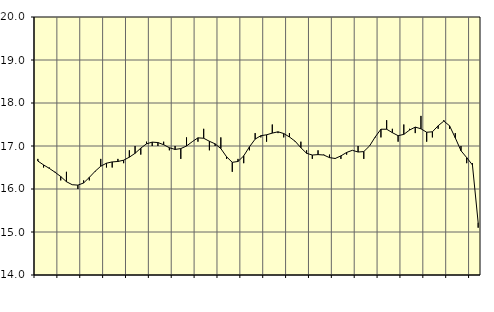
| Category | Piggar | Handel, SNI 45-47 |
|---|---|---|
| nan | 16.7 | 16.65 |
| 1.0 | 16.5 | 16.56 |
| 1.0 | 16.5 | 16.48 |
| 1.0 | 16.4 | 16.39 |
| nan | 16.2 | 16.29 |
| 2.0 | 16.4 | 16.17 |
| 2.0 | 16.1 | 16.1 |
| 2.0 | 16 | 16.09 |
| nan | 16.2 | 16.14 |
| 3.0 | 16.2 | 16.27 |
| 3.0 | 16.4 | 16.41 |
| 3.0 | 16.7 | 16.53 |
| nan | 16.5 | 16.6 |
| 4.0 | 16.5 | 16.63 |
| 4.0 | 16.7 | 16.64 |
| 4.0 | 16.6 | 16.67 |
| nan | 16.9 | 16.74 |
| 5.0 | 17 | 16.83 |
| 5.0 | 16.8 | 16.95 |
| 5.0 | 17.1 | 17.05 |
| nan | 17 | 17.09 |
| 6.0 | 17 | 17.08 |
| 6.0 | 17.1 | 17.03 |
| 6.0 | 16.9 | 16.96 |
| nan | 17 | 16.92 |
| 7.0 | 16.7 | 16.94 |
| 7.0 | 17.2 | 17 |
| 7.0 | 17.1 | 17.1 |
| nan | 17.1 | 17.19 |
| 8.0 | 17.4 | 17.18 |
| 8.0 | 16.9 | 17.11 |
| 8.0 | 17 | 17.05 |
| nan | 17.2 | 16.94 |
| 9.0 | 16.7 | 16.75 |
| 9.0 | 16.4 | 16.62 |
| 9.0 | 16.7 | 16.64 |
| nan | 16.6 | 16.77 |
| 10.0 | 16.9 | 16.98 |
| 10.0 | 17.3 | 17.16 |
| 10.0 | 17.2 | 17.24 |
| nan | 17.1 | 17.26 |
| 11.0 | 17.5 | 17.3 |
| 11.0 | 17.3 | 17.33 |
| 11.0 | 17.2 | 17.29 |
| nan | 17.3 | 17.21 |
| 12.0 | 17.1 | 17.11 |
| 12.0 | 17.1 | 16.96 |
| 12.0 | 16.9 | 16.83 |
| nan | 16.7 | 16.79 |
| 13.0 | 16.9 | 16.8 |
| 13.0 | 16.8 | 16.79 |
| 13.0 | 16.8 | 16.73 |
| nan | 16.7 | 16.71 |
| 14.0 | 16.7 | 16.77 |
| 14.0 | 16.8 | 16.85 |
| 14.0 | 16.9 | 16.9 |
| nan | 17 | 16.86 |
| 15.0 | 16.7 | 16.87 |
| 15.0 | 17 | 17 |
| 15.0 | 17.2 | 17.21 |
| nan | 17.2 | 17.39 |
| 16.0 | 17.6 | 17.39 |
| 16.0 | 17.4 | 17.31 |
| 16.0 | 17.1 | 17.24 |
| nan | 17.5 | 17.27 |
| 17.0 | 17.4 | 17.37 |
| 17.0 | 17.3 | 17.44 |
| 17.0 | 17.7 | 17.4 |
| nan | 17.1 | 17.32 |
| 18.0 | 17.2 | 17.33 |
| 18.0 | 17.4 | 17.47 |
| 18.0 | 17.6 | 17.58 |
| nan | 17.4 | 17.47 |
| 19.0 | 17.3 | 17.19 |
| 19.0 | 17 | 16.89 |
| 19.0 | 16.6 | 16.73 |
| nan | 16.6 | 16.56 |
| 20.0 | 15.1 | 15.22 |